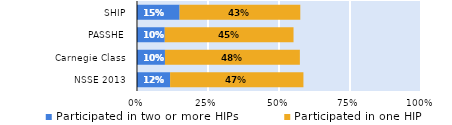
| Category | Participated in two or more HIPs | Participated in one HIP |
|---|---|---|
| NSSE 2013 | 0.117 | 0.469 |
| Carnegie Class | 0.098 | 0.475 |
| PASSHE | 0.098 | 0.453 |
| SHIP | 0.15 | 0.425 |